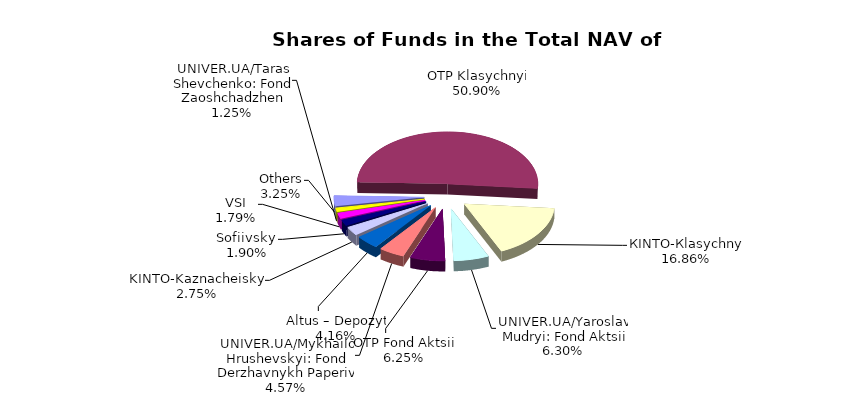
| Category | Series 0 | Series 1 |
|---|---|---|
| Others | 4771845.86 | 0.032 |
| ОТP Klasychnyi | 74645727.86 | 0.493 |
| КІNТО-Кlasychnyi | 24729025.31 | 0.163 |
| UNIVER.UA/Yaroslav Mudryi: Fond Aktsii | 9234759.27 | 0.061 |
| ОТP Fond Aktsii | 9172895.04 | 0.061 |
| UNIVER.UA/Мykhailo Hrushevskyi: Fond Derzhavnykh Paperiv | 6706844.77 | 0.044 |
| Altus – Depozyt | 6097532.89 | 0.04 |
| KINTO-Kaznacheiskyi | 4038460.97 | 0.027 |
| Sofiivskyi | 2787490.52 | 0.018 |
| VSI | 2629864.39 | 0.017 |
| UNIVER.UA/Taras Shevchenko: Fond Zaoshchadzhen | 1835617.47 | 0.012 |